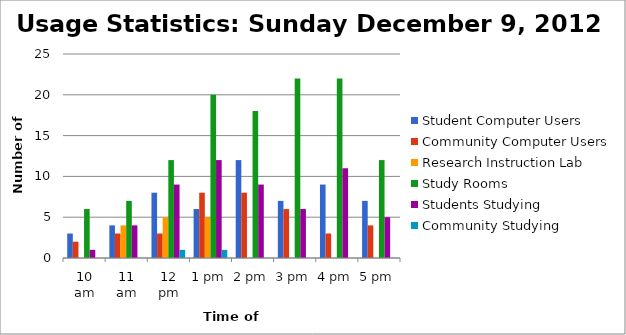
| Category | Student Computer Users | Community Computer Users | Research Instruction Lab | Study Rooms | Students Studying | Community Studying |
|---|---|---|---|---|---|---|
| 10 am | 3 | 2 | 0 | 6 | 1 | 0 |
| 11 am | 4 | 3 | 4 | 7 | 4 | 0 |
| 12 pm | 8 | 3 | 5 | 12 | 9 | 1 |
| 1 pm | 6 | 8 | 5 | 20 | 12 | 1 |
| 2 pm | 12 | 8 | 0 | 18 | 9 | 0 |
| 3 pm | 7 | 6 | 0 | 22 | 6 | 0 |
| 4 pm | 9 | 3 | 0 | 22 | 11 | 0 |
| 5 pm | 7 | 4 | 0 | 12 | 5 | 0 |